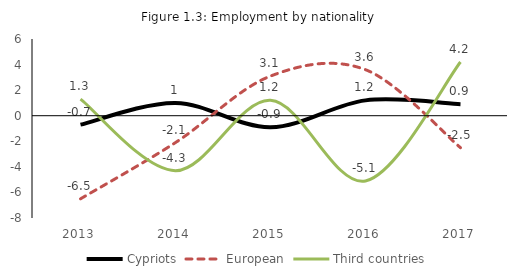
| Category | Cypriots | European | Third countries |
|---|---|---|---|
| 2013.0 | -0.7 | -6.5 | 1.3 |
| 2014.0 | 1 | -2.1 | -4.3 |
| 2015.0 | -0.9 | 3.1 | 1.2 |
| 2016.0 | 1.2 | 3.6 | -5.1 |
| 2017.0 | 0.9 | -2.5 | 4.2 |